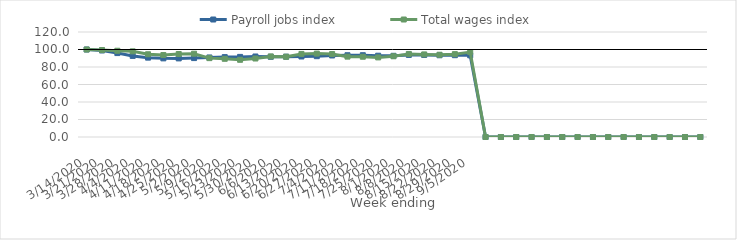
| Category | Payroll jobs index | Total wages index |
|---|---|---|
| 14/03/2020 | 100 | 100 |
| 21/03/2020 | 98.882 | 99.376 |
| 28/03/2020 | 95.901 | 98.587 |
| 04/04/2020 | 92.668 | 97.878 |
| 11/04/2020 | 90.705 | 94.558 |
| 18/04/2020 | 89.866 | 93.657 |
| 25/04/2020 | 89.827 | 94.822 |
| 02/05/2020 | 90.184 | 95.186 |
| 09/05/2020 | 90.9 | 90.14 |
| 16/05/2020 | 91.288 | 89.374 |
| 23/05/2020 | 91.554 | 88.232 |
| 30/05/2020 | 92.006 | 89.712 |
| 06/06/2020 | 91.666 | 92.055 |
| 13/06/2020 | 91.814 | 91.683 |
| 20/06/2020 | 92.013 | 94.932 |
| 27/06/2020 | 92.361 | 95.321 |
| 04/07/2020 | 93.166 | 94.816 |
| 11/07/2020 | 93.431 | 91.845 |
| 18/07/2020 | 93.468 | 91.727 |
| 25/07/2020 | 92.899 | 90.973 |
| 01/08/2020 | 92.793 | 92.283 |
| 08/08/2020 | 93.81 | 94.917 |
| 15/08/2020 | 93.726 | 94.39 |
| 22/08/2020 | 93.419 | 94.006 |
| 29/08/2020 | 93.491 | 94.708 |
| 05/09/2020 | 93.306 | 97.028 |